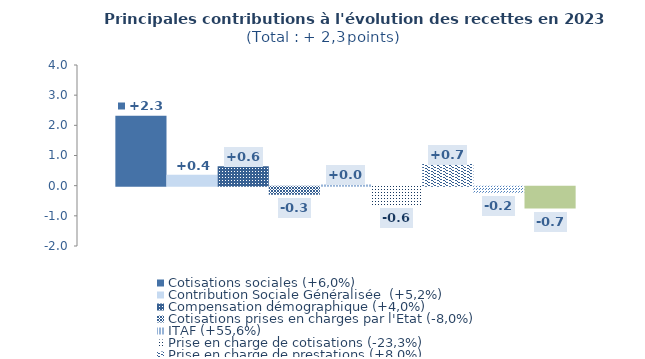
| Category | Cotisations sociales (+6,0%) | Contribution Sociale Généralisée  (+5,2%) | Compensation démographique (+4,0%) | Cotisations prises en charges par l'Etat (-8,0%) | ITAF (+55,6%) | Prise en charge de cotisations (-23,3%) | Prise en charge de prestations (+8,0%) | Contributions Régime général (-6,4%) | Autres produits (+5,5%) |
|---|---|---|---|---|---|---|---|---|---|
| 0 | 2.317 | 0.361 | 0.642 | -0.272 | 0.042 | -0.609 | 0.72 | -0.199 | -0.727 |